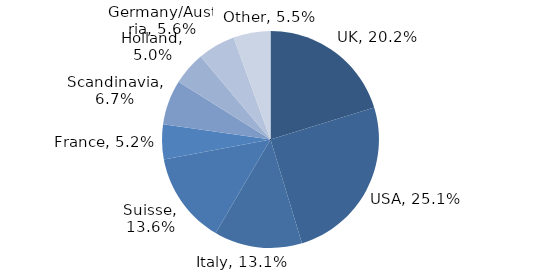
| Category | Investment Style |
|---|---|
| UK | 0.202 |
| USA | 0.251 |
| Italy | 0.131 |
| Suisse | 0.136 |
| France | 0.052 |
| Scandinavia | 0.067 |
| Holland | 0.05 |
| Germany/Austria | 0.056 |
| Other | 0.055 |